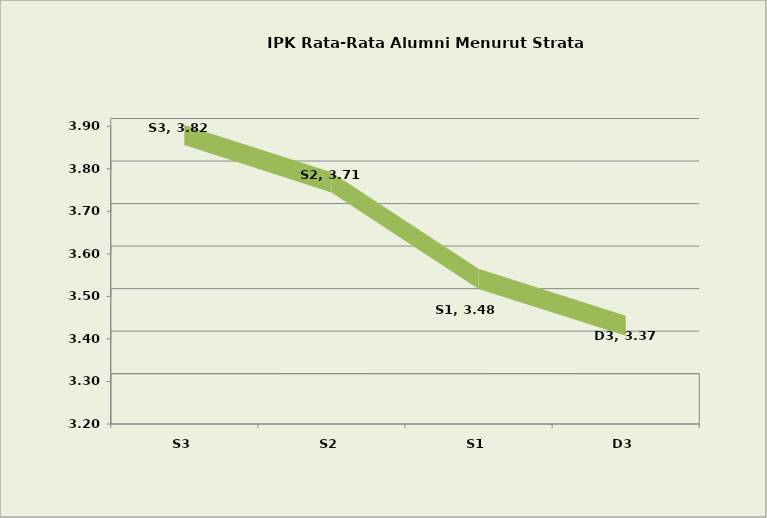
| Category | Series 0 |
|---|---|
| S3 | 3.819 |
| S2 | 3.707 |
| S1 | 3.48 |
| D3 | 3.37 |